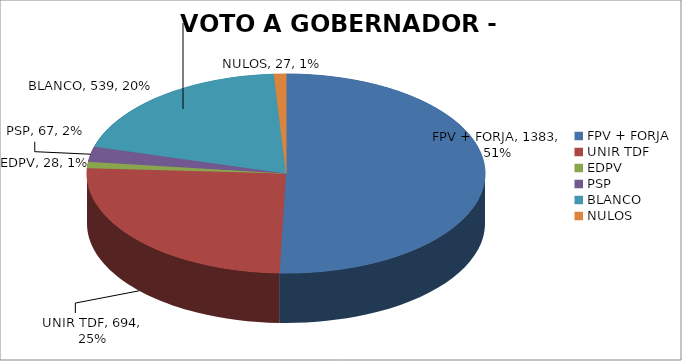
| Category | TOLHUIN |
|---|---|
| FPV + FORJA | 1383 |
| UNIR TDF | 694 |
| EDPV | 28 |
| PSP | 67 |
| BLANCO | 539 |
| NULOS | 27 |